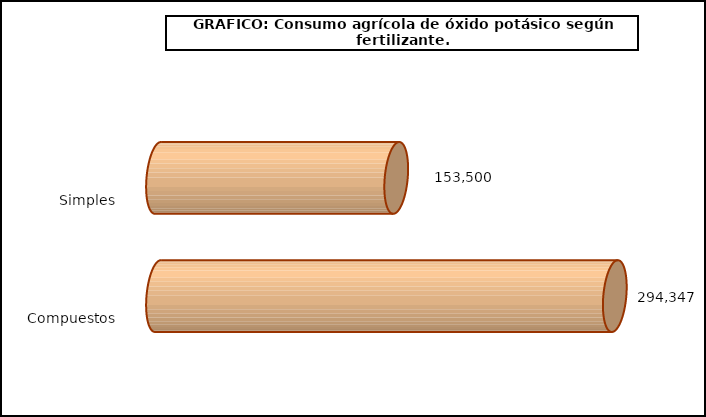
| Category | fert. N |
|---|---|
| 0 | 153500 |
| 1 | 294346.66 |